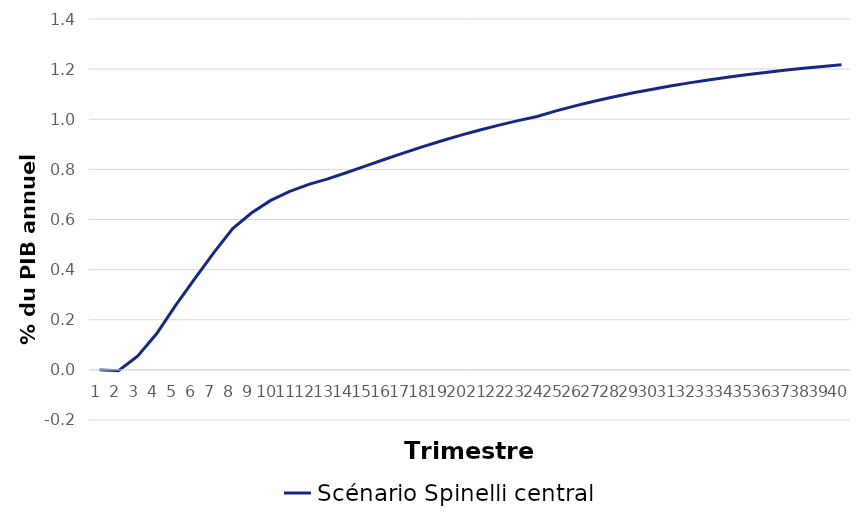
| Category | Scénario Spinelli central |
|---|---|
| 0 | 0 |
| 1 | -0.004 |
| 2 | 0.055 |
| 3 | 0.144 |
| 4 | 0.257 |
| 5 | 0.363 |
| 6 | 0.467 |
| 7 | 0.564 |
| 8 | 0.627 |
| 9 | 0.676 |
| 10 | 0.712 |
| 11 | 0.74 |
| 12 | 0.762 |
| 13 | 0.788 |
| 14 | 0.814 |
| 15 | 0.84 |
| 16 | 0.866 |
| 17 | 0.891 |
| 18 | 0.914 |
| 19 | 0.936 |
| 20 | 0.957 |
| 21 | 0.977 |
| 22 | 0.995 |
| 23 | 1.011 |
| 24 | 1.033 |
| 25 | 1.053 |
| 26 | 1.072 |
| 27 | 1.089 |
| 28 | 1.104 |
| 29 | 1.119 |
| 30 | 1.133 |
| 31 | 1.145 |
| 32 | 1.157 |
| 33 | 1.168 |
| 34 | 1.178 |
| 35 | 1.187 |
| 36 | 1.195 |
| 37 | 1.203 |
| 38 | 1.211 |
| 39 | 1.217 |